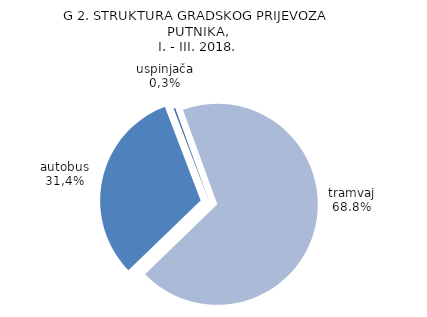
| Category | Series 0 |
|---|---|
| tramvaj | 47302 |
| autobus | 21752 |
| žičara i uspinjača | 172 |